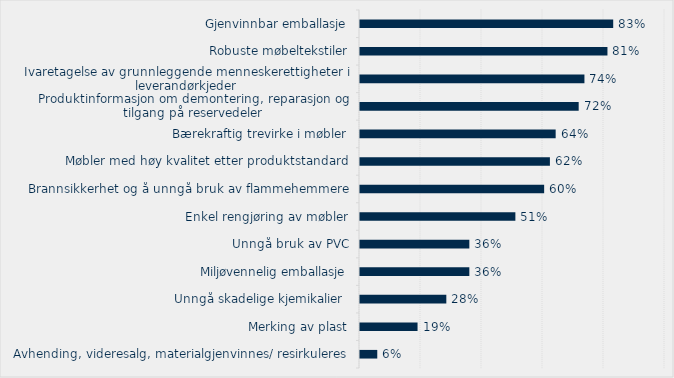
| Category | Series 0 |
|---|---|
| Avhending, videresalg, materialgjenvinnes/ resirkuleres | 0.057 |
| Merking av plast | 0.189 |
| Unngå skadelige kjemikalier  | 0.283 |
| Miljøvennelig emballasje | 0.358 |
| Unngå bruk av PVC | 0.358 |
| Enkel rengjøring av møbler | 0.509 |
| Brannsikkerhet og å unngå bruk av flammehemmere | 0.604 |
| Møbler med høy kvalitet etter produktstandard | 0.623 |
| Bærekraftig trevirke i møbler | 0.642 |
| Produktinformasjon om demontering, reparasjon og tilgang på reservedeler | 0.717 |
| Ivaretagelse av grunnleggende menneskerettigheter i leverandørkjeder | 0.736 |
| Robuste møbeltekstiler | 0.811 |
| Gjenvinnbar emballasje | 0.83 |